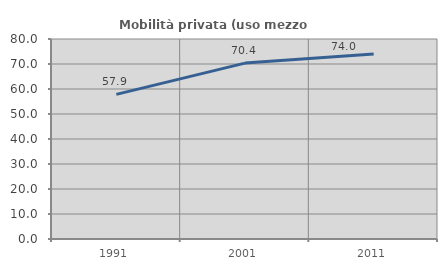
| Category | Mobilità privata (uso mezzo privato) |
|---|---|
| 1991.0 | 57.854 |
| 2001.0 | 70.355 |
| 2011.0 | 74.023 |